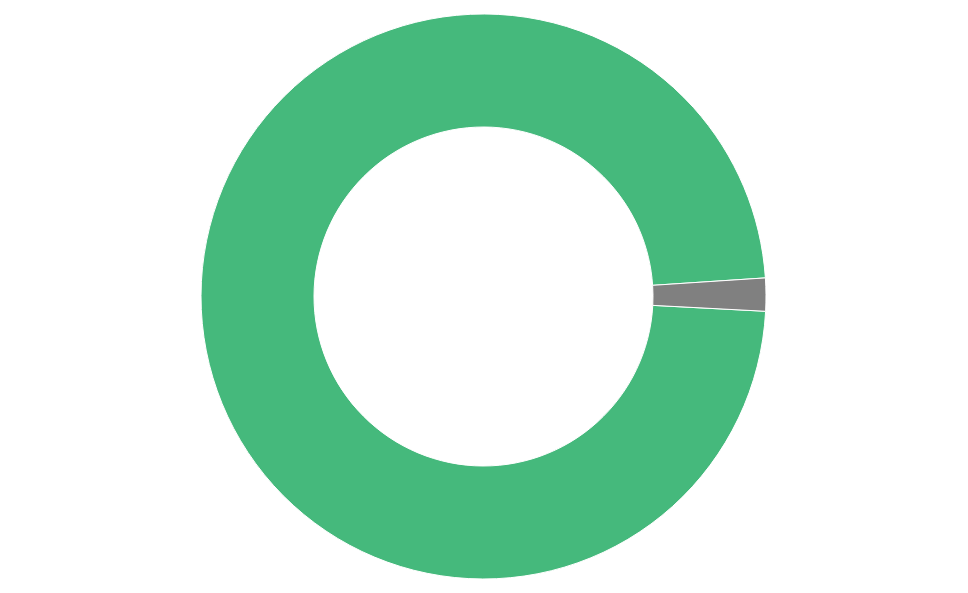
| Category | TOTAL |
|---|---|
| U.S. Total | 9871.114 |
| Export-Import Bank | 189.3 |